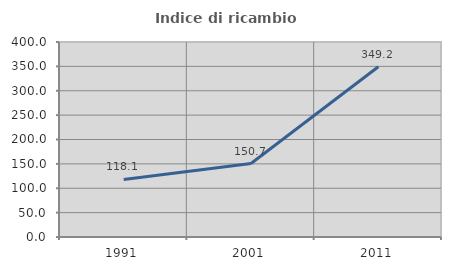
| Category | Indice di ricambio occupazionale  |
|---|---|
| 1991.0 | 118.133 |
| 2001.0 | 150.664 |
| 2011.0 | 349.196 |